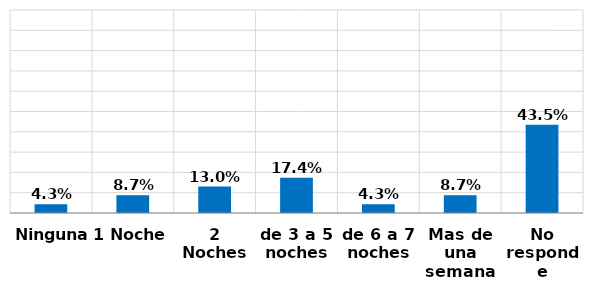
| Category | Series 0 |
|---|---|
| Ninguna | 0.043 |
| 1 Noche | 0.087 |
| 2 Noches | 0.13 |
| de 3 a 5 noches | 0.174 |
| de 6 a 7 noches | 0.043 |
| Mas de una semana | 0.087 |
| No responde | 0.435 |